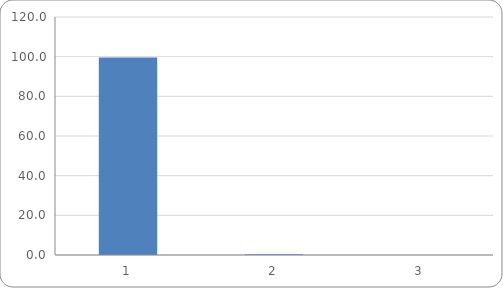
| Category | Component
Contribution
% |
|---|---|
| 0 | 99.629 |
| 1 | 0.368 |
| 2 | 0.003 |